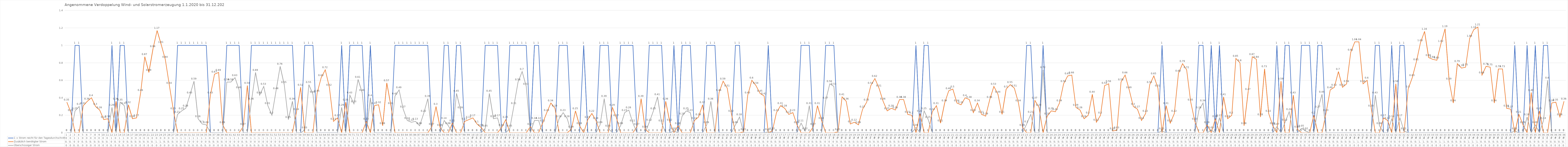
| Category | 1 = Strom reicht für den Tagesdurchschnitt | Zusätzlich benötigter Strom | Überschüssiger Strom |
|---|---|---|---|
| 0 | 0 | 0.35 | 0 |
| 1 | 0 | 0.23 | 0 |
| 2 | 1 | 0 | 0.25 |
| 3 | 1 | 0 | 0.3 |
| 4 | 0 | 0.31 | 0 |
| 5 | 0 | 0.36 | 0 |
| 6 | 0 | 0.4 | 0 |
| 7 | 0 | 0.3 | 0 |
| 8 | 0 | 0.26 | 0 |
| 9 | 0 | 0.15 | 0 |
| 10 | 0 | 0.16 | 0 |
| 11 | 1 | 0 | 0.29 |
| 12 | 0 | 0.36 | 0 |
| 13 | 1 | 0 | 0.35 |
| 14 | 1 | 0 | 0.31 |
| 15 | 0 | 0.32 | 0 |
| 16 | 0 | 0.16 | 0 |
| 17 | 0 | 0.17 | 0 |
| 18 | 0 | 0.46 | 0 |
| 19 | 0 | 0.87 | 0 |
| 20 | 0 | 0.69 | 0 |
| 21 | 0 | 0.96 | 0 |
| 22 | 0 | 1.17 | 0 |
| 23 | 0 | 1.01 | 0 |
| 24 | 0 | 0.84 | 0 |
| 25 | 0 | 0.54 | 0 |
| 26 | 0 | 0.25 | 0 |
| 27 | 1 | 0 | 0.21 |
| 28 | 1 | 0 | 0.25 |
| 29 | 1 | 0 | 0.28 |
| 30 | 1 | 0 | 0.43 |
| 31 | 1 | 0 | 0.59 |
| 32 | 1 | 0 | 0.16 |
| 33 | 1 | 0 | 0.1 |
| 34 | 1 | 0 | 0.09 |
| 35 | 0 | 0.43 | 0 |
| 36 | 0 | 0.67 | 0 |
| 37 | 0 | 0.69 | 0 |
| 38 | 0 | 0.09 | 0 |
| 39 | 1 | 0 | 0.58 |
| 40 | 1 | 0 | 0.58 |
| 41 | 1 | 0 | 0.63 |
| 42 | 1 | 0 | 0.49 |
| 43 | 0 | 0.07 | 0 |
| 44 | 0 | 0.54 | 0 |
| 45 | 1 | 0 | 0.36 |
| 46 | 1 | 0 | 0.69 |
| 47 | 1 | 0 | 0.43 |
| 48 | 1 | 0 | 0.53 |
| 49 | 1 | 0 | 0.31 |
| 50 | 1 | 0 | 0.2 |
| 51 | 1 | 0 | 0.48 |
| 52 | 1 | 0 | 0.76 |
| 53 | 1 | 0 | 0.55 |
| 54 | 1 | 0 | 0.15 |
| 55 | 1 | 0 | 0.36 |
| 56 | 0 | 0.24 | 0 |
| 57 | 0 | 0.52 | 0 |
| 58 | 1 | 0 | 0.03 |
| 59 | 1 | 0 | 0.55 |
| 60 | 1 | 0 | 0.44 |
| 61 | 0 | 0.45 | 0 |
| 62 | 0 | 0.63 | 0 |
| 63 | 0 | 0.72 | 0 |
| 64 | 0 | 0.52 | 0 |
| 65 | 0 | 0.13 | 0 |
| 66 | 0 | 0.17 | 0 |
| 67 | 1 | 0 | 0.29 |
| 68 | 0 | 0.35 | 0 |
| 69 | 1 | 0 | 0.43 |
| 70 | 1 | 0 | 0.33 |
| 71 | 1 | 0 | 0.61 |
| 72 | 1 | 0 | 0.46 |
| 73 | 0 | 0.13 | 0 |
| 74 | 1 | 0 | 0.4 |
| 75 | 0 | 0.31 | 0 |
| 76 | 0 | 0.32 | 0 |
| 77 | 0 | 0.08 | 0 |
| 78 | 0 | 0.57 | 0 |
| 79 | 0 | 0.31 | 0 |
| 80 | 1 | 0 | 0.42 |
| 81 | 1 | 0 | 0.49 |
| 82 | 1 | 0 | 0.27 |
| 83 | 1 | 0 | 0.14 |
| 84 | 1 | 0 | 0.12 |
| 85 | 1 | 0 | 0.13 |
| 86 | 1 | 0 | 0.08 |
| 87 | 1 | 0 | 0.22 |
| 88 | 1 | 0 | 0.39 |
| 89 | 0 | 0.07 | 0 |
| 90 | 0 | 0.3 | 0 |
| 91 | 0 | 0.06 | 0 |
| 92 | 1 | 0 | 0.14 |
| 93 | 1 | 0 | 0.08 |
| 94 | 0 | 0.11 | 0 |
| 95 | 1 | 0 | 0.45 |
| 96 | 1 | 0 | 0.26 |
| 97 | 0 | 0.13 | 0 |
| 98 | 0 | 0.15 | 0 |
| 99 | 0 | 0.17 | 0 |
| 100 | 0 | 0.1 | 0 |
| 101 | 0 | 0.06 | 0 |
| 102 | 1 | 0 | 0.05 |
| 103 | 1 | 0 | 0.45 |
| 104 | 1 | 0 | 0.16 |
| 105 | 1 | 0 | 0.17 |
| 106 | 0 | 0.06 | 0 |
| 107 | 0 | 0.15 | 0 |
| 108 | 1 | 0 | 0.05 |
| 109 | 1 | 0 | 0.31 |
| 110 | 1 | 0 | 0.58 |
| 111 | 1 | 0 | 0.7 |
| 112 | 1 | 0 | 0.53 |
| 113 | 0 | 0.07 | 0 |
| 114 | 1 | 0 | 0.14 |
| 115 | 1 | 0 | 0.14 |
| 116 | 0 | 0.11 | 0 |
| 117 | 0 | 0.23 | 0 |
| 118 | 0 | 0.34 | 0 |
| 119 | 0 | 0.28 | 0 |
| 120 | 1 | 0 | 0.16 |
| 121 | 1 | 0 | 0.23 |
| 122 | 1 | 0 | 0.16 |
| 123 | 0 | 0.04 | 0 |
| 124 | 0 | 0.25 | 0 |
| 125 | 0 | 0.08 | 0 |
| 126 | 1 | 0 | 0 |
| 127 | 0 | 0.15 | 0 |
| 128 | 0 | 0.22 | 0 |
| 129 | 0 | 0.14 | 0 |
| 130 | 1 | 0 | 0.09 |
| 131 | 1 | 0 | 0.39 |
| 132 | 1 | 0 | 0.05 |
| 133 | 0 | 0.29 | 0 |
| 134 | 0 | 0.17 | 0 |
| 135 | 1 | 0 | 0.08 |
| 136 | 1 | 0 | 0.23 |
| 137 | 1 | 0 | 0.26 |
| 138 | 1 | 0 | 0.11 |
| 139 | 0 | 0.07 | 0 |
| 140 | 0 | 0.39 | 0 |
| 141 | 0 | 0.04 | 0 |
| 142 | 1 | 0 | 0.12 |
| 143 | 1 | 0 | 0.25 |
| 144 | 1 | 0 | 0.41 |
| 145 | 1 | 0 | 0.11 |
| 146 | 0 | 0.36 | 0 |
| 147 | 0 | 0.12 | 0 |
| 148 | 1 | 0 | 0.02 |
| 149 | 0 | 0.08 | 0 |
| 150 | 1 | 0 | 0.19 |
| 151 | 1 | 0 | 0.25 |
| 152 | 1 | 0 | 0.23 |
| 153 | 0 | 0.14 | 0 |
| 154 | 0 | 0.18 | 0 |
| 155 | 0 | 0.32 | 0 |
| 156 | 1 | 0 | 0.09 |
| 157 | 1 | 0 | 0.36 |
| 158 | 1 | 0 | 0 |
| 159 | 0 | 0.46 | 0 |
| 160 | 0 | 0.59 | 0 |
| 161 | 0 | 0.51 | 0 |
| 162 | 0 | 0.22 | 0 |
| 163 | 1 | 0 | 0.09 |
| 164 | 1 | 0 | 0.18 |
| 165 | 0 | 0.01 | 0 |
| 166 | 0 | 0.43 | 0 |
| 167 | 0 | 0.6 | 0 |
| 168 | 0 | 0.54 | 0 |
| 169 | 0 | 0.45 | 0 |
| 170 | 0 | 0.42 | 0 |
| 171 | 1 | 0 | 0.01 |
| 172 | 0 | 0.02 | 0 |
| 173 | 0 | 0.23 | 0 |
| 174 | 0 | 0.31 | 0 |
| 175 | 0 | 0.28 | 0 |
| 176 | 0 | 0.21 | 0 |
| 177 | 0 | 0.23 | 0 |
| 178 | 0 | 0.09 | 0 |
| 179 | 1 | 0 | 0.11 |
| 180 | 1 | 0 | 0.02 |
| 181 | 1 | 0 | 0.31 |
| 182 | 0 | 0.07 | 0 |
| 183 | 0 | 0.31 | 0 |
| 184 | 0 | 0.14 | 0 |
| 185 | 1 | 0 | 0.37 |
| 186 | 1 | 0 | 0.56 |
| 187 | 1 | 0 | 0.53 |
| 188 | 0 | 0.01 | 0 |
| 189 | 0 | 0.41 | 0 |
| 190 | 0 | 0.36 | 0 |
| 191 | 0 | 0.1 | 0 |
| 192 | 0 | 0.12 | 0 |
| 193 | 0 | 0.09 | 0 |
| 194 | 0 | 0.27 | 0 |
| 195 | 0 | 0.35 | 0 |
| 196 | 0 | 0.54 | 0 |
| 197 | 0 | 0.62 | 0 |
| 198 | 0 | 0.51 | 0 |
| 199 | 0 | 0.36 | 0 |
| 200 | 0 | 0.25 | 0 |
| 201 | 0 | 0.28 | 0 |
| 202 | 0 | 0.26 | 0 |
| 203 | 0 | 0.38 | 0 |
| 204 | 0 | 0.38 | 0 |
| 205 | 0 | 0.21 | 0 |
| 206 | 0 | 0.2 | 0 |
| 207 | 1 | 0 | 0.06 |
| 208 | 0 | 0.22 | 0 |
| 209 | 1 | 0 | 0.25 |
| 210 | 1 | 0 | 0.15 |
| 211 | 0 | 0.24 | 0 |
| 212 | 0 | 0.31 | 0 |
| 213 | 0 | 0.11 | 0 |
| 214 | 0 | 0.34 | 0 |
| 215 | 0 | 0.48 | 0 |
| 216 | 0 | 0.5 | 0 |
| 217 | 0 | 0.34 | 0 |
| 218 | 0 | 0.32 | 0 |
| 219 | 0 | 0.4 | 0 |
| 220 | 0 | 0.38 | 0 |
| 221 | 0 | 0.23 | 0 |
| 222 | 0 | 0.34 | 0 |
| 223 | 0 | 0.21 | 0 |
| 224 | 0 | 0.19 | 0 |
| 225 | 0 | 0.38 | 0 |
| 226 | 0 | 0.53 | 0 |
| 227 | 0 | 0.44 | 0 |
| 228 | 0 | 0.21 | 0 |
| 229 | 0 | 0.5 | 0 |
| 230 | 0 | 0.55 | 0 |
| 231 | 0 | 0.51 | 0 |
| 232 | 0 | 0.34 | 0 |
| 233 | 0 | 0.06 | 0 |
| 234 | 1 | 0 | 0.1 |
| 235 | 1 | 0 | 0.21 |
| 236 | 0 | 0.37 | 0 |
| 237 | 0 | 0.29 | 0 |
| 238 | 1 | 0 | 0.72 |
| 239 | 0 | 0.19 | 0 |
| 240 | 0 | 0.25 | 0 |
| 241 | 0 | 0.24 | 0 |
| 242 | 0 | 0.34 | 0 |
| 243 | 0 | 0.56 | 0 |
| 244 | 0 | 0.65 | 0 |
| 245 | 0 | 0.66 | 0 |
| 246 | 0 | 0.29 | 0 |
| 247 | 0 | 0.26 | 0 |
| 248 | 0 | 0.16 | 0 |
| 249 | 0 | 0.2 | 0 |
| 250 | 0 | 0.44 | 0 |
| 251 | 0 | 0.12 | 0 |
| 252 | 0 | 0.2 | 0 |
| 253 | 0 | 0.54 | 0 |
| 254 | 0 | 0.56 | 0 |
| 255 | 0 | 0.02 | 0 |
| 256 | 0 | 0.03 | 0 |
| 257 | 0 | 0.58 | 0 |
| 258 | 0 | 0.66 | 0 |
| 259 | 0 | 0.49 | 0 |
| 260 | 0 | 0.3 | 0 |
| 261 | 0 | 0.27 | 0 |
| 262 | 0 | 0.14 | 0 |
| 263 | 0 | 0.22 | 0 |
| 264 | 0 | 0.55 | 0 |
| 265 | 0 | 0.65 | 0 |
| 266 | 0 | 0.51 | 0 |
| 267 | 1 | 0 | 0.02 |
| 268 | 0 | 0.31 | 0 |
| 269 | 0 | 0.11 | 0 |
| 270 | 0 | 0.22 | 0 |
| 271 | 0 | 0.68 | 0 |
| 272 | 0 | 0.79 | 0 |
| 273 | 0 | 0.72 | 0 |
| 274 | 0 | 0.35 | 0 |
| 275 | 0 | 0.13 | 0 |
| 276 | 1 | 0 | 0.26 |
| 277 | 1 | 0 | 0.34 |
| 278 | 0 | 0.09 | 0 |
| 279 | 1 | 0 | 0.03 |
| 280 | 0 | 0.16 | 0 |
| 281 | 1 | 0 | 0.17 |
| 282 | 0 | 0.41 | 0 |
| 283 | 0 | 0.16 | 0 |
| 284 | 0 | 0.2 | 0 |
| 285 | 0 | 0.85 | 0 |
| 286 | 0 | 0.8 | 0 |
| 287 | 0 | 0.08 | 0 |
| 288 | 0 | 0.47 | 0 |
| 289 | 0 | 0.87 | 0 |
| 290 | 0 | 0.84 | 0 |
| 291 | 0 | 0.18 | 0 |
| 292 | 0 | 0.73 | 0 |
| 293 | 0 | 0.22 | 0 |
| 294 | 0 | 0.08 | 0 |
| 295 | 1 | 0 | 0.07 |
| 296 | 0 | 0.59 | 0 |
| 297 | 1 | 0 | 0.12 |
| 298 | 1 | 0 | 0.24 |
| 299 | 0 | 0.43 | 0 |
| 300 | 0 | 0.04 | 0 |
| 301 | 1 | 0 | 0.05 |
| 302 | 1 | 0 | 0.02 |
| 303 | 1 | 0 | 0 |
| 304 | 0 | 0.2 | 0 |
| 305 | 1 | 0 | 0.27 |
| 306 | 1 | 0 | 0.44 |
| 307 | 0 | 0.23 | 0 |
| 308 | 0 | 0.49 | 0 |
| 309 | 0 | 0.52 | 0 |
| 310 | 0 | 0.7 | 0 |
| 311 | 0 | 0.52 | 0 |
| 312 | 0 | 0.56 | 0 |
| 313 | 0 | 0.92 | 0 |
| 314 | 0 | 1.04 | 0 |
| 315 | 0 | 1.04 | 0 |
| 316 | 0 | 0.56 | 0 |
| 317 | 0 | 0.6 | 0 |
| 318 | 0 | 0.28 | 0 |
| 319 | 1 | 0 | 0.43 |
| 320 | 1 | 0 | 0.08 |
| 321 | 0 | 0.17 | 0 |
| 322 | 0 | 0.14 | 0 |
| 323 | 1 | 0 | 0.16 |
| 324 | 0 | 0.56 | 0 |
| 325 | 1 | 0 | 0.17 |
| 326 | 1 | 0 | 0.02 |
| 327 | 0 | 0.5 | 0 |
| 328 | 0 | 0.63 | 0 |
| 329 | 0 | 0.81 | 0 |
| 330 | 0 | 1.03 | 0 |
| 331 | 0 | 1.16 | 0 |
| 332 | 0 | 0.86 | 0 |
| 333 | 0 | 0.84 | 0 |
| 334 | 0 | 0.83 | 0 |
| 335 | 0 | 1.02 | 0 |
| 336 | 0 | 1.19 | 0 |
| 337 | 0 | 0.59 | 0 |
| 338 | 0 | 0.34 | 0 |
| 339 | 0 | 0.79 | 0 |
| 340 | 0 | 0.74 | 0 |
| 341 | 0 | 0.75 | 0 |
| 342 | 0 | 1.08 | 0 |
| 343 | 0 | 1.18 | 0 |
| 344 | 0 | 1.21 | 0 |
| 345 | 0 | 0.66 | 0 |
| 346 | 0 | 0.76 | 0 |
| 347 | 0 | 0.75 | 0 |
| 348 | 0 | 0.34 | 0 |
| 349 | 0 | 0.73 | 0 |
| 350 | 0 | 0.73 | 0 |
| 351 | 0 | 0.28 | 0 |
| 352 | 0 | 0.27 | 0 |
| 353 | 1 | 0 | 0.02 |
| 354 | 0 | 0.21 | 0 |
| 355 | 0 | 0.09 | 0 |
| 356 | 1 | 0 | 0.18 |
| 357 | 0 | 0.46 | 0 |
| 358 | 1 | 0 | 0.09 |
| 359 | 0 | 0.25 | 0 |
| 360 | 1 | 0 | 0.14 |
| 361 | 1 | 0 | 0.6 |
| 362 | 0 | 0.34 | 0 |
| 363 | 0 | 0.35 | 0 |
| 364 | 0 | 0.18 | 0 |
| 365 | 0 | 0.36 | 0 |